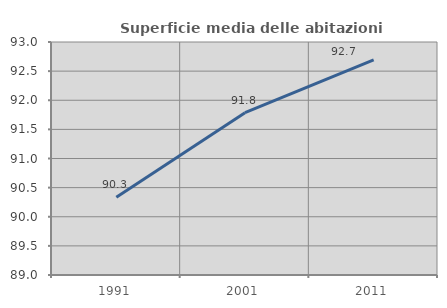
| Category | Superficie media delle abitazioni occupate |
|---|---|
| 1991.0 | 90.336 |
| 2001.0 | 91.787 |
| 2011.0 | 92.695 |